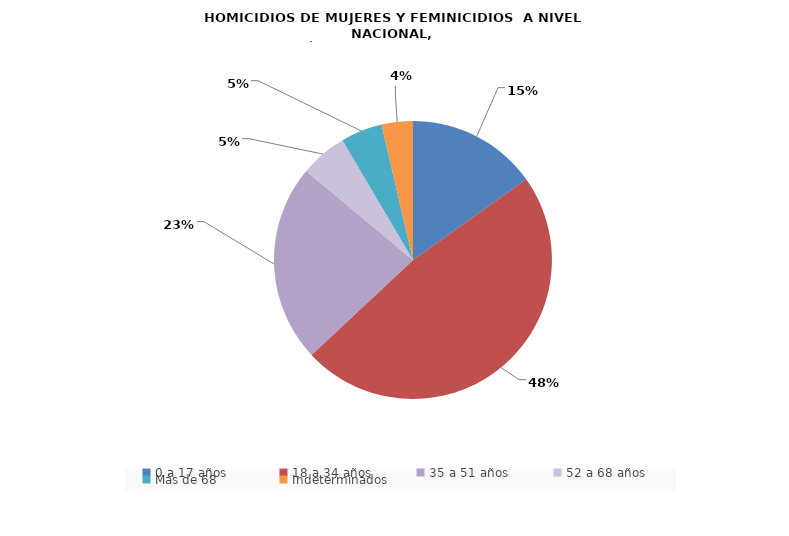
| Category | Series 0 |
|---|---|
| 0 a 17 años | 25 |
| 18 a 34 años | 79 |
| 35 a 51 años | 38 |
| 52 a 68 años | 9 |
| Más de 68 | 8 |
| Indeterminados | 6 |